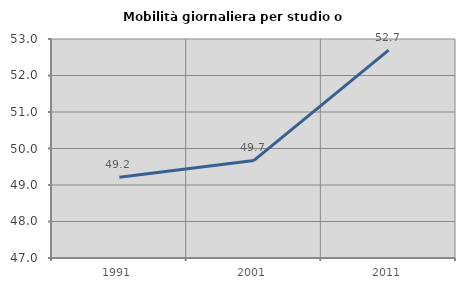
| Category | Mobilità giornaliera per studio o lavoro |
|---|---|
| 1991.0 | 49.212 |
| 2001.0 | 49.674 |
| 2011.0 | 52.697 |